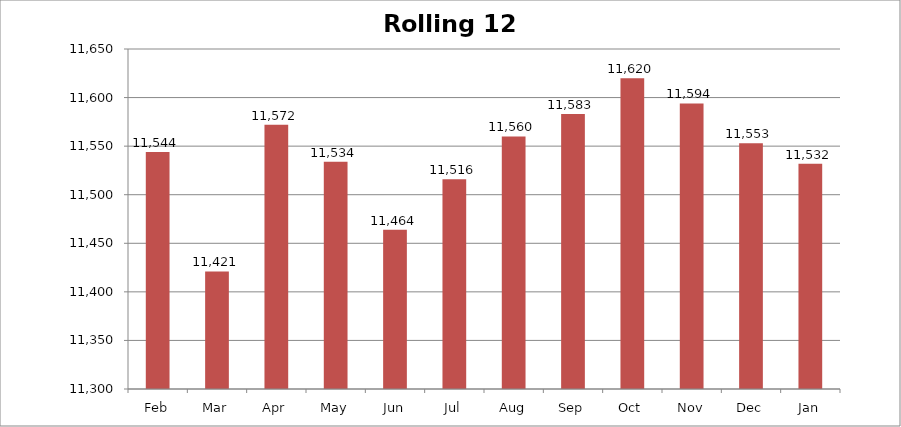
| Category | Rolling 12 Month |
|---|---|
| Feb | 11544 |
| Mar | 11421 |
| Apr | 11572 |
| May | 11534 |
| Jun | 11464 |
| Jul | 11516 |
| Aug | 11560 |
| Sep | 11583 |
| Oct | 11620 |
| Nov | 11594 |
| Dec | 11553 |
| Jan | 11532 |